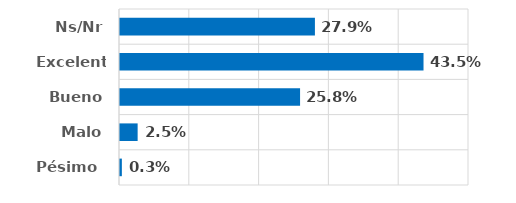
| Category | Series 0 |
|---|---|
| Pésimo  | 0.003 |
| Malo | 0.025 |
| Bueno | 0.258 |
| Excelente | 0.435 |
| Ns/Nr | 0.279 |